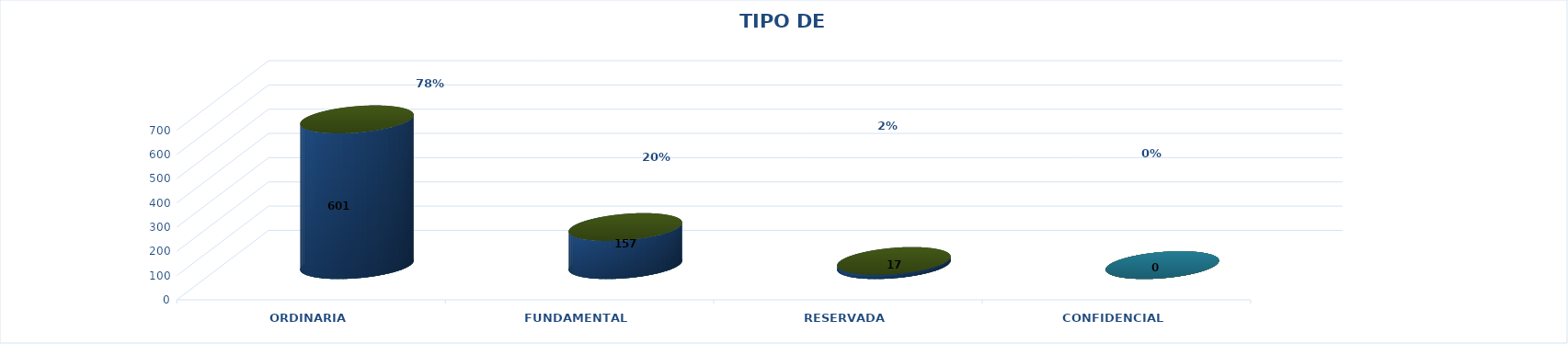
| Category | Series 0 | Series 2 | Series 1 | Series 3 | Series 4 |
|---|---|---|---|---|---|
| ORDINARIA |  |  |  | 601 | 0.775 |
| FUNDAMENTAL |  |  |  | 157 | 0.203 |
| RESERVADA |  |  |  | 17 | 0.022 |
| CONFIDENCIAL |  |  |  | 0 | 0 |